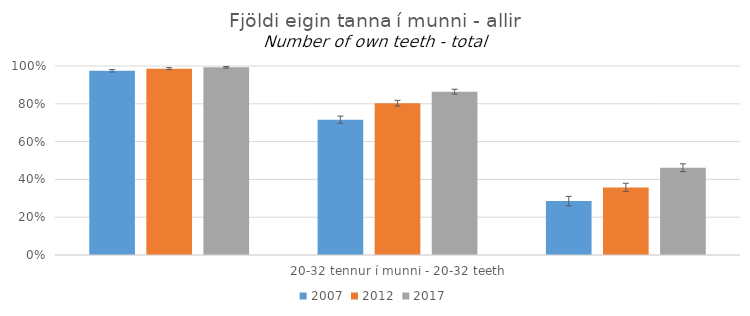
| Category | 2007 | 2012 | 2017 |
|---|---|---|---|
| 0 | 0.975 | 0.986 | 0.993 |
| 1 | 0.716 | 0.803 | 0.864 |
| 2 | 0.285 | 0.358 | 0.462 |